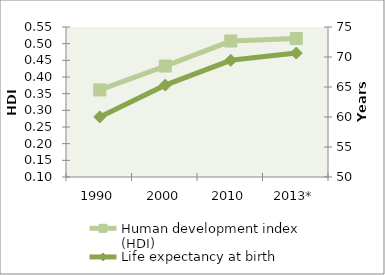
| Category | Human development index (HDI) |
|---|---|
| 1990 | 0.361 |
| 2000 | 0.433 |
| 2010 | 0.508 |
| 2013* | 0.515 |